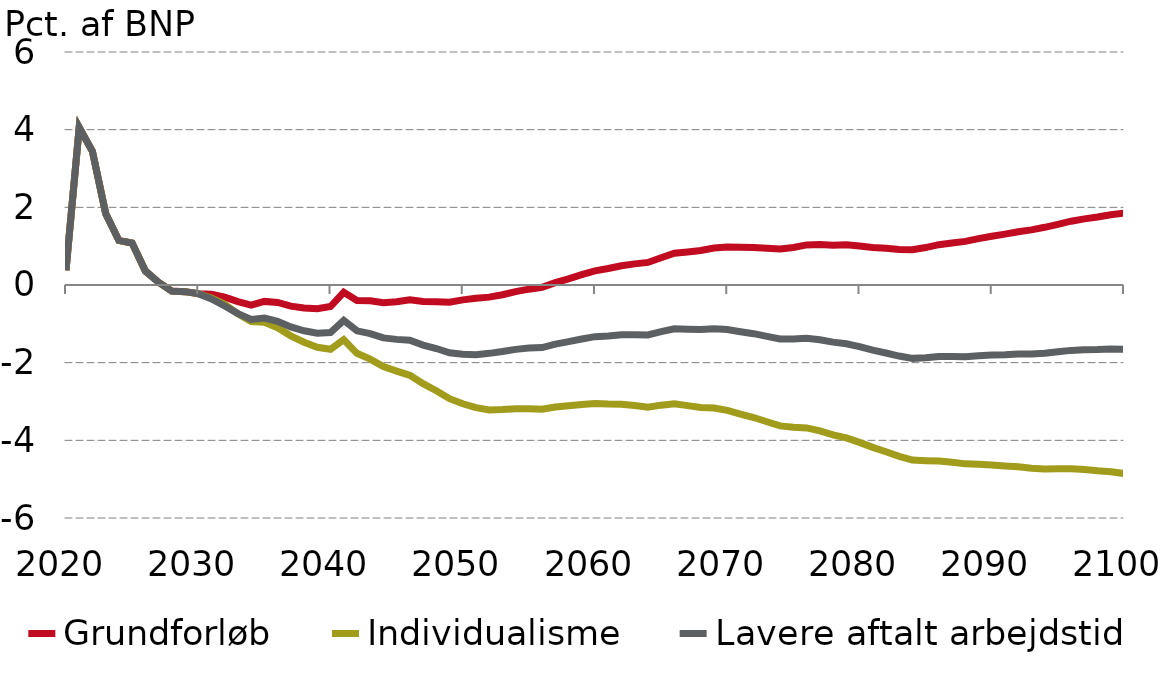
| Category |  Grundforløb |  Individualisme |  Lavere aftalt arbejdstid |
|---|---|---|---|
| 0 | 0.38 | 0.38 | 0.38 |
| 1 | 4.057 | 4.057 | 4.057 |
| 2 | 3.44 | 3.44 | 3.44 |
| 3 | 1.84 | 1.84 | 1.84 |
| 4 | 1.147 | 1.147 | 1.147 |
| 5 | 1.081 | 1.081 | 1.081 |
| 6 | 0.362 | 0.362 | 0.362 |
| 7 | 0.07 | 0.07 | 0.07 |
| 8 | -0.158 | -0.158 | -0.158 |
| 9 | -0.171 | -0.171 | -0.171 |
| 10 | -0.223 | -0.223 | -0.223 |
| 11 | -0.241 | -0.336 | -0.358 |
| 12 | -0.311 | -0.499 | -0.541 |
| 13 | -0.429 | -0.74 | -0.736 |
| 14 | -0.517 | -0.943 | -0.888 |
| 15 | -0.422 | -0.96 | -0.851 |
| 16 | -0.449 | -1.1 | -0.933 |
| 17 | -0.545 | -1.309 | -1.08 |
| 18 | -0.594 | -1.473 | -1.179 |
| 19 | -0.61 | -1.603 | -1.24 |
| 20 | -0.555 | -1.656 | -1.223 |
| 21 | -0.188 | -1.409 | -0.91 |
| 22 | -0.399 | -1.759 | -1.181 |
| 23 | -0.407 | -1.908 | -1.251 |
| 24 | -0.456 | -2.101 | -1.363 |
| 25 | -0.431 | -2.219 | -1.4 |
| 26 | -0.382 | -2.326 | -1.423 |
| 27 | -0.426 | -2.541 | -1.546 |
| 28 | -0.43 | -2.722 | -1.636 |
| 29 | -0.445 | -2.927 | -1.746 |
| 30 | -0.383 | -3.059 | -1.784 |
| 31 | -0.341 | -3.16 | -1.794 |
| 32 | -0.312 | -3.22 | -1.76 |
| 33 | -0.252 | -3.207 | -1.713 |
| 34 | -0.171 | -3.185 | -1.657 |
| 35 | -0.107 | -3.184 | -1.625 |
| 36 | -0.062 | -3.198 | -1.611 |
| 37 | 0.06 | -3.141 | -1.523 |
| 38 | 0.159 | -3.11 | -1.459 |
| 39 | 0.265 | -3.075 | -1.391 |
| 40 | 0.363 | -3.049 | -1.331 |
| 41 | 0.424 | -3.064 | -1.312 |
| 42 | 0.495 | -3.071 | -1.283 |
| 43 | 0.544 | -3.103 | -1.278 |
| 44 | 0.581 | -3.147 | -1.285 |
| 45 | 0.702 | -3.094 | -1.2 |
| 46 | 0.819 | -3.057 | -1.127 |
| 47 | 0.852 | -3.106 | -1.138 |
| 48 | 0.887 | -3.154 | -1.147 |
| 49 | 0.952 | -3.169 | -1.126 |
| 50 | 0.976 | -3.229 | -1.148 |
| 51 | 0.969 | -3.322 | -1.203 |
| 52 | 0.966 | -3.413 | -1.254 |
| 53 | 0.944 | -3.523 | -1.324 |
| 54 | 0.928 | -3.627 | -1.389 |
| 55 | 0.965 | -3.662 | -1.391 |
| 56 | 1.033 | -3.679 | -1.371 |
| 57 | 1.041 | -3.756 | -1.409 |
| 58 | 1.026 | -3.858 | -1.472 |
| 59 | 1.034 | -3.937 | -1.513 |
| 60 | 1.007 | -4.052 | -1.589 |
| 61 | 0.968 | -4.182 | -1.679 |
| 62 | 0.947 | -4.293 | -1.75 |
| 63 | 0.917 | -4.411 | -1.83 |
| 64 | 0.907 | -4.509 | -1.889 |
| 65 | 0.964 | -4.523 | -1.872 |
| 66 | 1.038 | -4.53 | -1.844 |
| 67 | 1.083 | -4.565 | -1.842 |
| 68 | 1.123 | -4.606 | -1.847 |
| 69 | 1.193 | -4.614 | -1.821 |
| 70 | 1.254 | -4.633 | -1.804 |
| 71 | 1.31 | -4.661 | -1.795 |
| 72 | 1.372 | -4.682 | -1.777 |
| 73 | 1.42 | -4.718 | -1.776 |
| 74 | 1.486 | -4.737 | -1.757 |
| 75 | 1.562 | -4.73 | -1.718 |
| 76 | 1.643 | -4.731 | -1.684 |
| 77 | 1.703 | -4.752 | -1.667 |
| 78 | 1.752 | -4.786 | -1.663 |
| 79 | 1.811 | -4.81 | -1.65 |
| 80 | 1.852 | -4.854 | -1.655 |